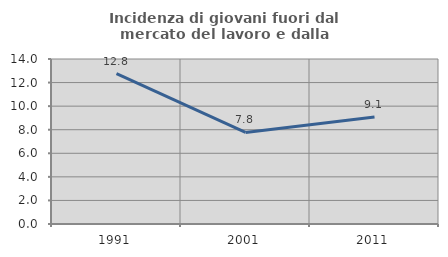
| Category | Incidenza di giovani fuori dal mercato del lavoro e dalla formazione  |
|---|---|
| 1991.0 | 12.758 |
| 2001.0 | 7.765 |
| 2011.0 | 9.069 |